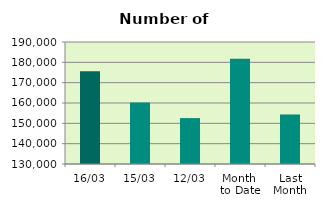
| Category | Series 0 |
|---|---|
| 16/03 | 175626 |
| 15/03 | 160206 |
| 12/03 | 152570 |
| Month 
to Date | 181711.5 |
| Last
Month | 154356.5 |